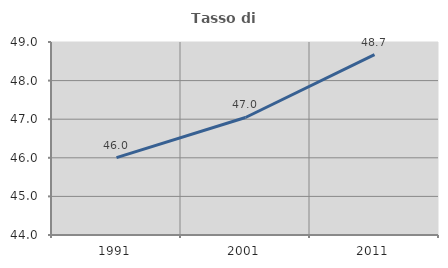
| Category | Tasso di occupazione   |
|---|---|
| 1991.0 | 46.003 |
| 2001.0 | 47.044 |
| 2011.0 | 48.675 |